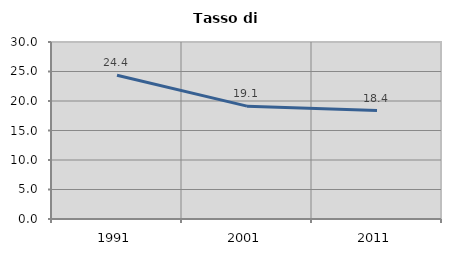
| Category | Tasso di disoccupazione   |
|---|---|
| 1991.0 | 24.376 |
| 2001.0 | 19.128 |
| 2011.0 | 18.371 |